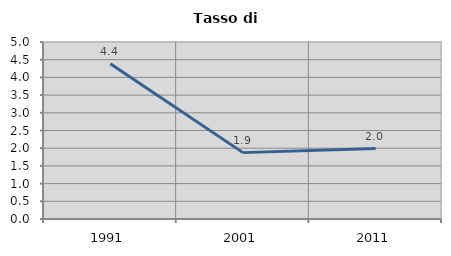
| Category | Tasso di disoccupazione   |
|---|---|
| 1991.0 | 4.382 |
| 2001.0 | 1.875 |
| 2011.0 | 1.99 |